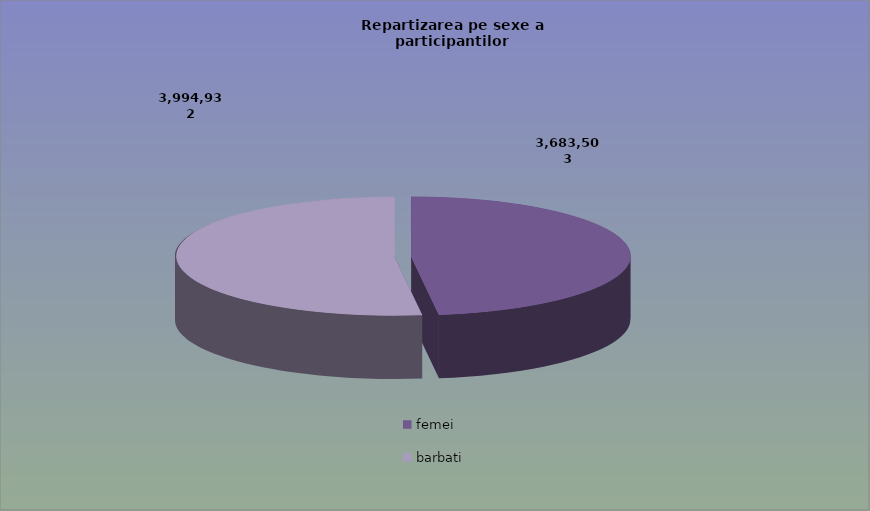
| Category | Series 0 |
|---|---|
| femei | 3683503 |
| barbati | 3994932 |